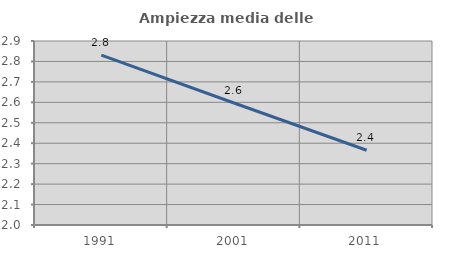
| Category | Ampiezza media delle famiglie |
|---|---|
| 1991.0 | 2.831 |
| 2001.0 | 2.597 |
| 2011.0 | 2.365 |